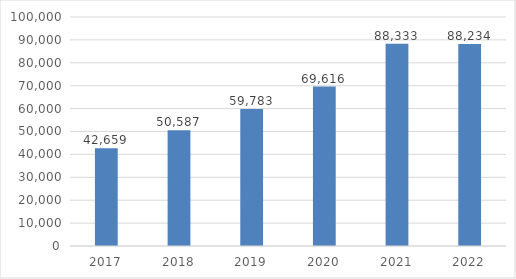
| Category | Series 0 |
|---|---|
| 2017.0 | 42659 |
| 2018.0 | 50587 |
| 2019.0 | 59783 |
| 2020.0 | 69616 |
| 2021.0 | 88333 |
| 2022.0 | 88234 |